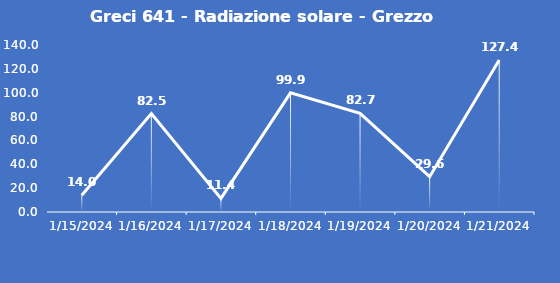
| Category | Greci 641 - Radiazione solare - Grezzo (W/m2) |
|---|---|
| 1/15/24 | 14 |
| 1/16/24 | 82.5 |
| 1/17/24 | 11.4 |
| 1/18/24 | 99.9 |
| 1/19/24 | 82.7 |
| 1/20/24 | 29.6 |
| 1/21/24 | 127.4 |